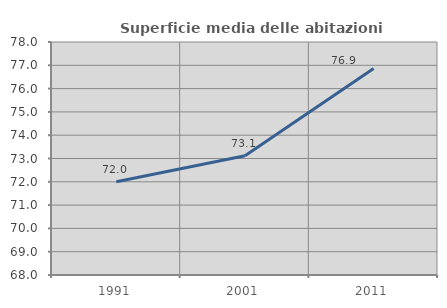
| Category | Superficie media delle abitazioni occupate |
|---|---|
| 1991.0 | 72.002 |
| 2001.0 | 73.115 |
| 2011.0 | 76.866 |